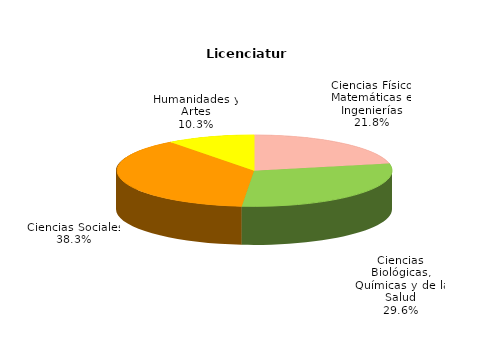
| Category | Series 0 |
|---|---|
| Ciencias Físico Matemáticas e Ingenierías | 44888 |
| Ciencias Biológicas, Químicas y de la Salud | 60831 |
| Ciencias Sociales | 78729 |
| Humanidades y Artes | 21200 |